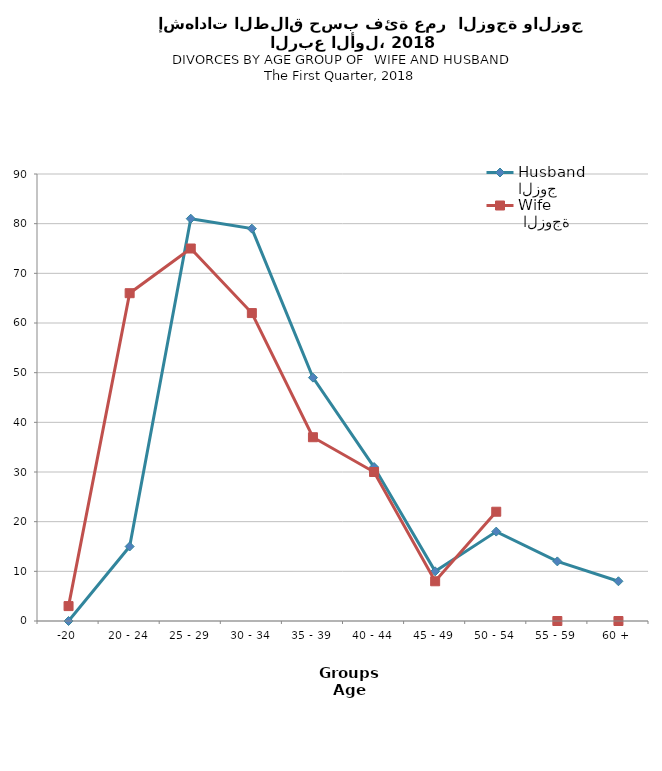
| Category | الزوج
Husband |  الزوجة
Wife |
|---|---|---|
| -20 | 0 | 3 |
| 20 - 24 | 15 | 66 |
| 25 - 29 | 81 | 75 |
| 30 - 34 | 79 | 62 |
| 35 - 39 | 49 | 37 |
| 40 - 44 | 31 | 30 |
| 45 - 49 | 10 | 8 |
| 50 - 54 | 18 | 22 |
| 55 - 59 | 12 | 0 |
| 60 + | 8 | 0 |